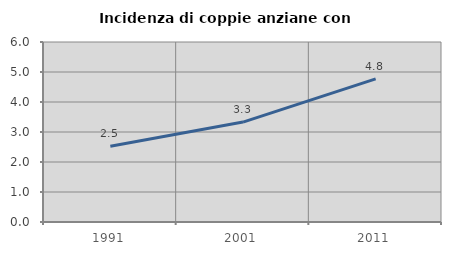
| Category | Incidenza di coppie anziane con figli |
|---|---|
| 1991.0 | 2.524 |
| 2001.0 | 3.33 |
| 2011.0 | 4.769 |